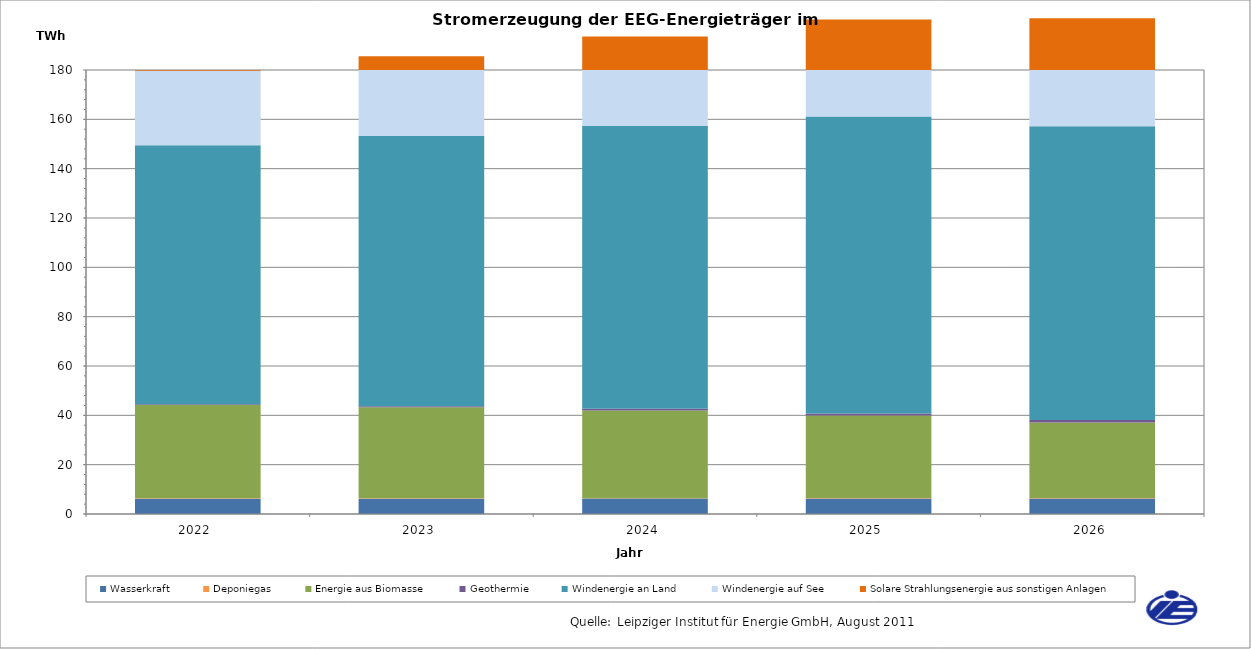
| Category | Wasserkraft | Deponiegas | Energie aus Biomasse | Geothermie | Windenergie an Land | Windenergie auf See | Solare Strahlungsenergie aus sonstigen Anlagen |
|---|---|---|---|---|---|---|---|
| 2022.0 | 6174.431 | 197.872 | 37810.238 | 347.511 | 104914.812 | 30205.086 | 38711.805 |
| 2023.0 | 6207.057 | 188.342 | 36841.437 | 492.752 | 109486.929 | 32320.589 | 41728.64 |
| 2024.0 | 6239.683 | 177.887 | 35577.631 | 651.95 | 114695.823 | 36244.277 | 44936.585 |
| 2025.0 | 6272.31 | 165.366 | 33520.187 | 831.151 | 120341.688 | 39353.894 | 48171.543 |
| 2026.0 | 6304.936 | 157.588 | 30611.006 | 1027.104 | 119110.204 | 43803.742 | 51392.787 |